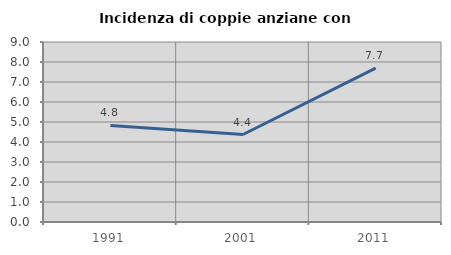
| Category | Incidenza di coppie anziane con figli |
|---|---|
| 1991.0 | 4.828 |
| 2001.0 | 4.375 |
| 2011.0 | 7.692 |